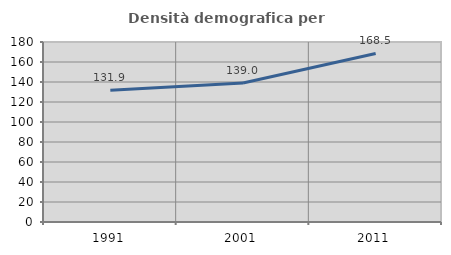
| Category | Densità demografica |
|---|---|
| 1991.0 | 131.851 |
| 2001.0 | 139.04 |
| 2011.0 | 168.541 |